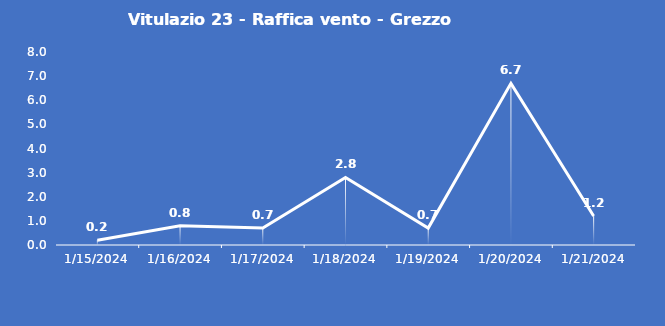
| Category | Vitulazio 23 - Raffica vento - Grezzo (m/s) |
|---|---|
| 1/15/24 | 0.2 |
| 1/16/24 | 0.8 |
| 1/17/24 | 0.7 |
| 1/18/24 | 2.8 |
| 1/19/24 | 0.7 |
| 1/20/24 | 6.7 |
| 1/21/24 | 1.2 |